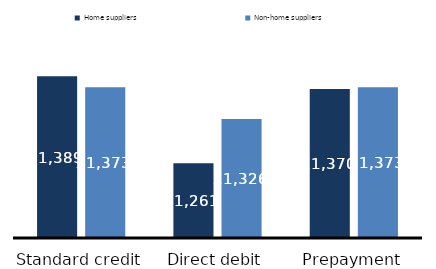
| Category | Home suppliers | Non-home suppliers |
|---|---|---|
| Standard credit | 1389.104 | 1372.686 |
| Direct debit | 1260.6 | 1325.928 |
| Prepayment | 1370.302 | 1372.623 |